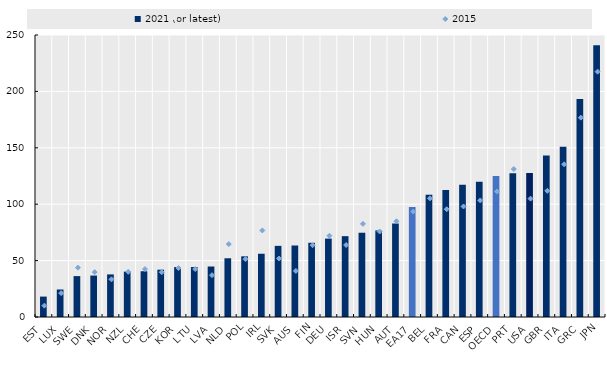
| Category | 2021 (or latest) |
|---|---|
| EST | 18.095 |
| LUX | 24.388 |
| SWE | 36.26 |
| DNK | 36.741 |
| NOR | 37.759 |
| NZL | 40.219 |
| CHE | 40.575 |
| CZE | 41.949 |
| KOR | 44.234 |
| LTU | 44.301 |
| LVA | 44.771 |
| NLD | 52.075 |
| POL | 53.791 |
| IRL | 56.07 |
| SVK | 63.074 |
| AUS | 63.383 |
| FIN | 65.792 |
| DEU | 69.506 |
| ISR | 71.672 |
| SVN | 74.698 |
| HUN | 76.759 |
| AUT | 82.896 |
| EA17 | 97.516 |
| BEL | 108.395 |
| FRA | 112.577 |
| CAN | 117.261 |
| ESP | 119.951 |
| OECD | 125.018 |
| PRT | 127.43 |
| USA | 127.57 |
| GBR | 143.102 |
| ITA | 150.973 |
| GRC | 193.288 |
| JPN | 240.926 |